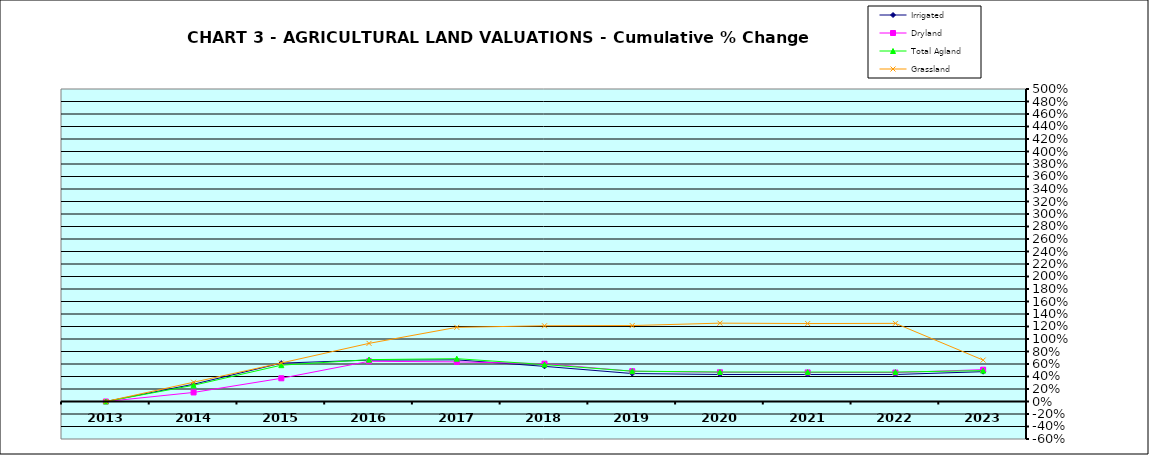
| Category | Irrigated | Dryland | Total Agland | Grassland |
|---|---|---|---|---|
| 2013.0 | 0 | 0 | 0 | 0 |
| 2014.0 | 0.276 | 0.145 | 0.26 | 0.308 |
| 2015.0 | 0.614 | 0.371 | 0.581 | 0.617 |
| 2016.0 | 0.662 | 0.643 | 0.67 | 0.93 |
| 2017.0 | 0.666 | 0.634 | 0.685 | 1.187 |
| 2018.0 | 0.562 | 0.605 | 0.591 | 1.212 |
| 2019.0 | 0.447 | 0.484 | 0.485 | 1.215 |
| 2020.0 | 0.432 | 0.468 | 0.472 | 1.254 |
| 2021.0 | 0.432 | 0.465 | 0.471 | 1.247 |
| 2022.0 | 0.432 | 0.463 | 0.471 | 1.25 |
| 2023.0 | 0.477 | 0.509 | 0.494 | 0.663 |